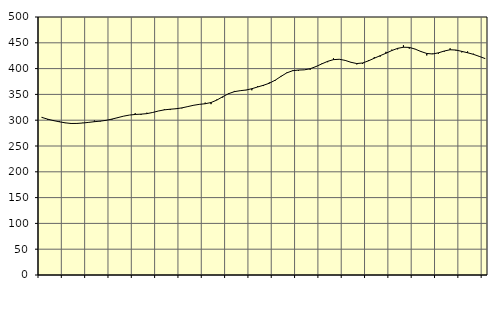
| Category | Piggar | Series 1 |
|---|---|---|
| nan | 306.3 | 305.4 |
| 1.0 | 300.5 | 301.99 |
| 1.0 | 300.4 | 299.18 |
| 1.0 | 298.2 | 296.88 |
| nan | 294.4 | 294.9 |
| 2.0 | 293 | 293.65 |
| 2.0 | 293.3 | 293.74 |
| 2.0 | 295 | 294.57 |
| nan | 295.3 | 295.75 |
| 3.0 | 299.3 | 297.11 |
| 3.0 | 297.4 | 298.19 |
| 3.0 | 299.4 | 299.73 |
| nan | 300.9 | 302.13 |
| 4.0 | 304.2 | 304.96 |
| 4.0 | 307.7 | 307.83 |
| 4.0 | 309.9 | 309.94 |
| nan | 313.5 | 311.13 |
| 5.0 | 310.3 | 311.72 |
| 5.0 | 314.5 | 312.72 |
| 5.0 | 315.2 | 315.01 |
| nan | 318 | 317.89 |
| 6.0 | 321.3 | 320.06 |
| 6.0 | 319.7 | 321.3 |
| 6.0 | 322.6 | 322.2 |
| nan | 323 | 323.87 |
| 7.0 | 326.8 | 326.35 |
| 7.0 | 329.3 | 328.91 |
| 7.0 | 330.4 | 330.71 |
| nan | 334 | 331.9 |
| 8.0 | 331.1 | 334.23 |
| 8.0 | 340.1 | 338.99 |
| 8.0 | 343.9 | 345.5 |
| nan | 352.2 | 351.3 |
| 9.0 | 356.7 | 355.33 |
| 9.0 | 357.3 | 357.17 |
| 9.0 | 358.2 | 358.48 |
| nan | 358 | 361.03 |
| 10.0 | 366 | 364.38 |
| 10.0 | 366.2 | 367.71 |
| 10.0 | 373.2 | 371.66 |
| nan | 376.5 | 377.5 |
| 11.0 | 385.8 | 384.92 |
| 11.0 | 392.4 | 391.72 |
| 11.0 | 396.8 | 395.91 |
| nan | 395.7 | 397.19 |
| 12.0 | 397.5 | 397.61 |
| 12.0 | 397.8 | 399.7 |
| 12.0 | 403.6 | 403.96 |
| nan | 409.9 | 409.13 |
| 13.0 | 412.4 | 414.06 |
| 13.0 | 419.9 | 417.37 |
| 13.0 | 418.3 | 418.06 |
| nan | 415.6 | 415.92 |
| 14.0 | 412.5 | 412.24 |
| 14.0 | 408.1 | 409.79 |
| 14.0 | 409 | 410.89 |
| nan | 416.4 | 415.04 |
| 15.0 | 422.2 | 420.09 |
| 15.0 | 423.1 | 425.02 |
| 15.0 | 432.5 | 429.73 |
| nan | 436.7 | 434.98 |
| 16.0 | 437.3 | 439.22 |
| 16.0 | 445.2 | 441.4 |
| 16.0 | 438.6 | 441.09 |
| nan | 438.1 | 437.8 |
| 17.0 | 432.5 | 433.08 |
| 17.0 | 425.5 | 429.34 |
| 17.0 | 429.1 | 428.34 |
| nan | 428.8 | 430.55 |
| 18.0 | 432.9 | 434.06 |
| 18.0 | 439.3 | 436.51 |
| 18.0 | 434.9 | 435.96 |
| nan | 431.4 | 433.39 |
| 19.0 | 433.3 | 430.71 |
| 19.0 | 428.8 | 427.63 |
| 19.0 | 424.2 | 423.69 |
| nan | 419.8 | 419.44 |